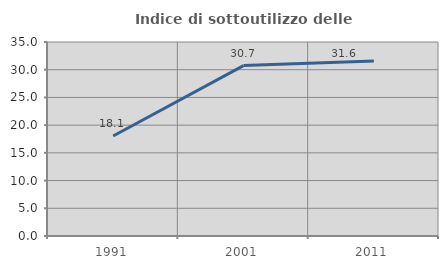
| Category | Indice di sottoutilizzo delle abitazioni  |
|---|---|
| 1991.0 | 18.051 |
| 2001.0 | 30.742 |
| 2011.0 | 31.579 |